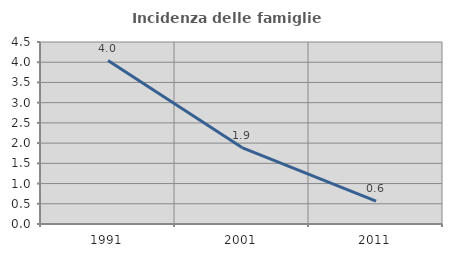
| Category | Incidenza delle famiglie numerose |
|---|---|
| 1991.0 | 4.04 |
| 2001.0 | 1.891 |
| 2011.0 | 0.564 |